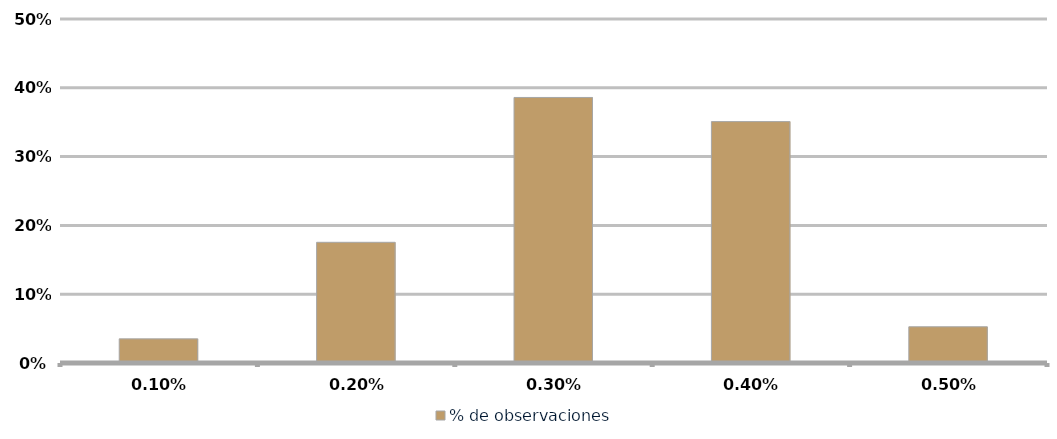
| Category | % de observaciones  |
|---|---|
| 0.001 | 0.035 |
| 0.002 | 0.175 |
| 0.003 | 0.386 |
| 0.004 | 0.351 |
| 0.005 | 0.053 |